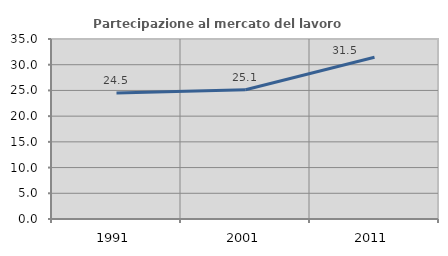
| Category | Partecipazione al mercato del lavoro  femminile |
|---|---|
| 1991.0 | 24.511 |
| 2001.0 | 25.144 |
| 2011.0 | 31.454 |